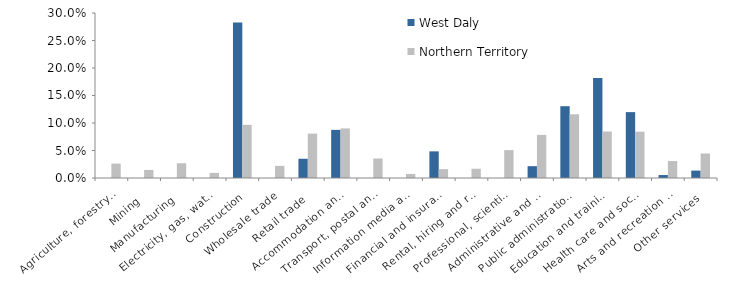
| Category | West Daly | Northern Territory |
|---|---|---|
| Agriculture, forestry and fishing | 0 | 0.026 |
| Mining | 0 | 0.015 |
| Manufacturing | 0 | 0.027 |
| Electricity, gas, water and waste services | 0 | 0.009 |
| Construction | 0.283 | 0.097 |
| Wholesale trade | 0 | 0.022 |
| Retail trade | 0.035 | 0.081 |
| Accommodation and food services | 0.087 | 0.09 |
| Transport, postal and warehousing | 0 | 0.035 |
| Information media and telecommunications | 0 | 0.007 |
| Financial and insurance services | 0.048 | 0.016 |
| Rental, hiring and real estate services | 0 | 0.017 |
| Professional, scientific and technical services | 0 | 0.051 |
| Administrative and support services | 0.022 | 0.078 |
| Public administration and safety | 0.131 | 0.116 |
| Education and training | 0.182 | 0.084 |
| Health care and social assistance | 0.12 | 0.084 |
| Arts and recreation services | 0.005 | 0.031 |
| Other services | 0.013 | 0.045 |